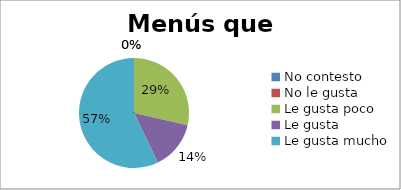
| Category | Series 2 | Series 1 | Series 0 |
|---|---|---|---|
| No contesto | 0 |  | 0 |
| No le gusta | 0 |  | 0 |
| Le gusta poco | 28.571 |  | 2 |
| Le gusta | 14.286 |  | 1 |
| Le gusta mucho | 57.143 |  | 4 |